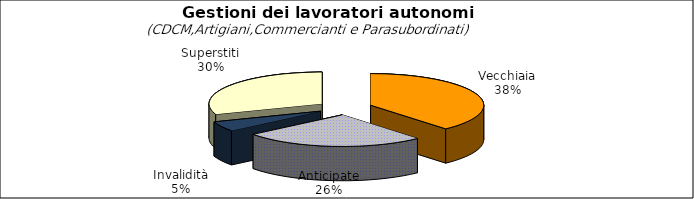
| Category | Series 0 |
|---|---|
| Vecchiaia | 66744 |
| Anticipate | 45110 |
| Invalidità | 8835 |
| Superstiti | 52903 |